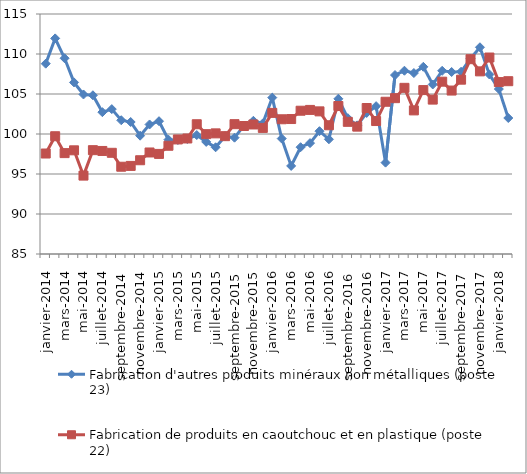
| Category | Fabrication d'autres produits minéraux non métalliques (poste 23) | Fabrication de produits en caoutchouc et en plastique (poste 22) |
|---|---|---|
|  janvier-2014 | 108.79 | 97.56 |
|  février-2014 | 111.95 | 99.72 |
|  mars-2014 | 109.47 | 97.61 |
|  avril-2014 | 106.45 | 97.96 |
|  mai-2014 | 104.94 | 94.8 |
|  juin-2014 | 104.84 | 97.98 |
|  juillet-2014 | 102.73 | 97.88 |
|  août-2014 | 103.11 | 97.65 |
|  septembre-2014 | 101.72 | 95.91 |
|  octobre-2014 | 101.5 | 96.01 |
|  novembre-2014 | 99.79 | 96.72 |
|  décembre-2014 | 101.19 | 97.69 |
|  janvier-2015 | 101.6 | 97.51 |
|  février-2015 | 99.29 | 98.53 |
|  mars-2015 | 99.25 | 99.32 |
|  avril-2015 | 99.37 | 99.44 |
|  mai-2015 | 99.87 | 101.22 |
|  juin-2015 | 99.01 | 99.98 |
|  juillet-2015 | 98.34 | 100.08 |
|  août-2015 | 99.73 | 99.73 |
|  septembre-2015 | 99.54 | 101.23 |
|  octobre-2015 | 101.04 | 101 |
|  novembre-2015 | 101.65 | 101.19 |
|  décembre-2015 | 101.33 | 100.76 |
|  janvier-2016 | 104.55 | 102.64 |
|  février-2016 | 99.43 | 101.84 |
|  mars-2016 | 96.01 | 101.87 |
|  avril-2016 | 98.35 | 102.91 |
|  mai-2016 | 98.86 | 103.01 |
|  juin-2016 | 100.35 | 102.83 |
|  juillet-2016 | 99.34 | 101.09 |
|  août-2016 | 104.4 | 103.5 |
|  septembre-2016 | 101.98 | 101.52 |
|  octobre-2016 | 101.08 | 100.92 |
|  novembre-2016 | 102.63 | 103.25 |
|  décembre-2016 | 103.48 | 101.62 |
|  janvier-2017 | 96.42 | 104.03 |
|  février-2017 | 107.37 | 104.48 |
|  mars-2017 | 107.91 | 105.77 |
|  avril-2017 | 107.62 | 102.95 |
|  mai-2017 | 108.4 | 105.49 |
|  juin-2017 | 106.19 | 104.3 |
|  juillet-2017 | 107.9 | 106.54 |
|  août-2017 | 107.75 | 105.43 |
|  septembre-2017 | 107.78 | 106.79 |
|  octobre-2017 | 109.42 | 109.35 |
|  novembre-2017 | 110.84 | 107.83 |
|  décembre-2017 | 107.44 | 109.56 |
|  janvier-2018 | 105.62 | 106.49 |
|  février-2018 | 102 | 106.6 |